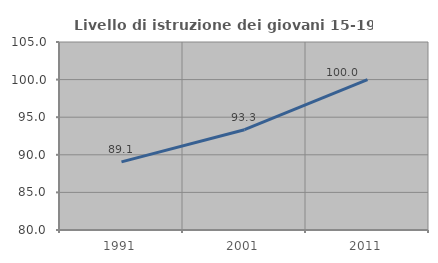
| Category | Livello di istruzione dei giovani 15-19 anni |
|---|---|
| 1991.0 | 89.062 |
| 2001.0 | 93.333 |
| 2011.0 | 100 |